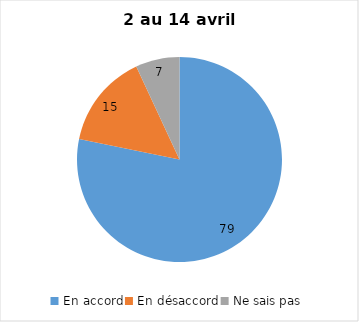
| Category | Series 0 |
|---|---|
| En accord | 79 |
| En désaccord | 15 |
| Ne sais pas | 7 |